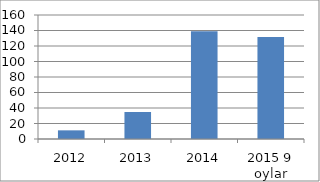
| Category | Series 0 |
|---|---|
| 2012 | 11.17 |
| 2013 | 34.82 |
| 2014 | 138.9 |
| 2015 9 oylar | 131.6 |